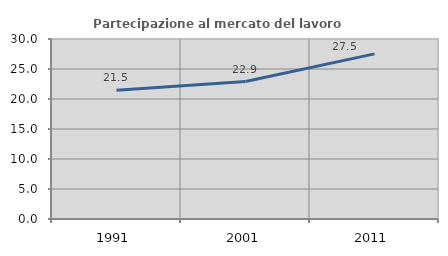
| Category | Partecipazione al mercato del lavoro  femminile |
|---|---|
| 1991.0 | 21.465 |
| 2001.0 | 22.914 |
| 2011.0 | 27.518 |